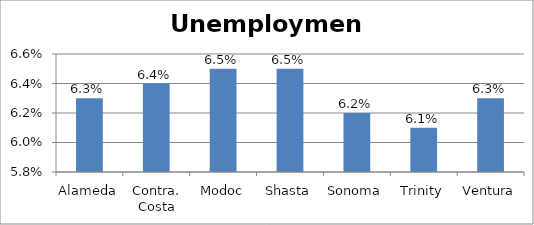
| Category | Series 0 |
|---|---|
| Alameda | 0.063 |
| Contra. Costa | 0.064 |
| Modoc | 0.065 |
| Shasta | 0.065 |
| Sonoma | 0.062 |
| Trinity | 0.061 |
| Ventura | 0.063 |